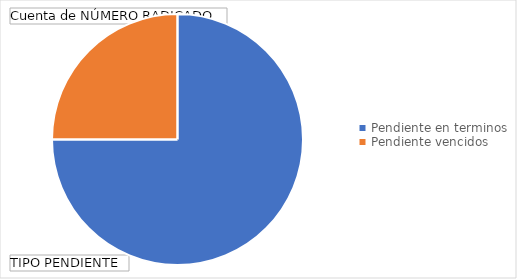
| Category | Total |
|---|---|
| Pendiente en terminos | 24 |
| Pendiente vencidos | 8 |